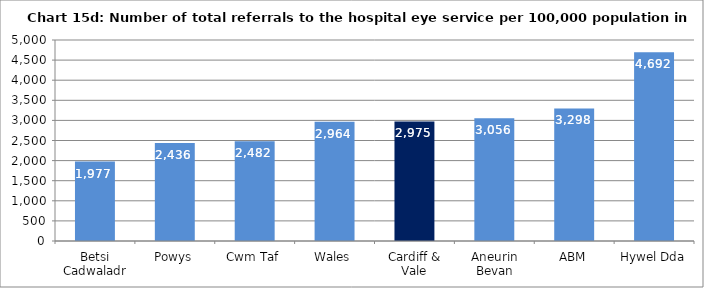
| Category | Chart 15d: Number of total referrals to the hospital eye service per 100,000 population in 2016-17 |
|---|---|
| Betsi Cadwaladr | 1977.471 |
| Powys | 2435.88 |
| Cwm Taf | 2482.35 |
| Wales | 2963.648 |
| Cardiff & Vale | 2974.717 |
| Aneurin Bevan | 3056.263 |
| ABM | 3298.406 |
| Hywel Dda | 4692.495 |